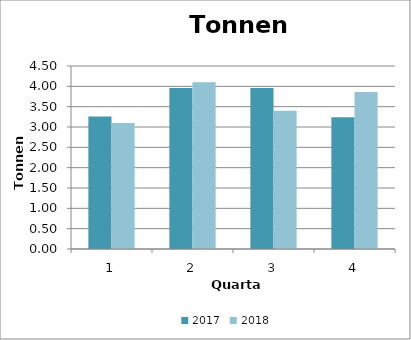
| Category | 2017 | 2018 |
|---|---|---|
| 0 | 3.26 | 3.1 |
| 1 | 3.96 | 4.1 |
| 2 | 3.96 | 3.4 |
| 3 | 3.24 | 3.86 |